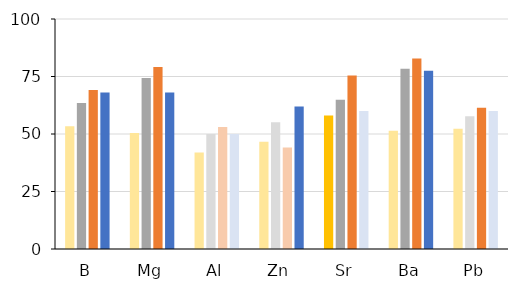
| Category | FO | IOM | ICE | GOM |
|---|---|---|---|---|
| B | 53.333 | 63.514 | 69.118 | 68 |
| Mg | 50.459 | 74.324 | 79.141 | 68 |
| Al | 41.905 | 50 | 53.086 | 50 |
| Zn | 46.667 | 55.128 | 44.118 | 62 |
| Sr | 58.095 | 64.865 | 75.439 | 60 |
| Ba | 51.429 | 78.378 | 82.822 | 77.5 |
| Pb | 52.294 | 57.692 | 61.404 | 60 |